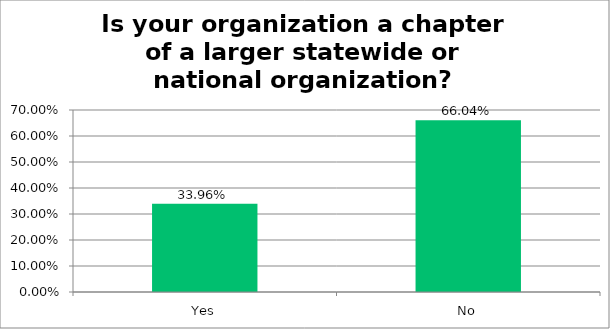
| Category | Responses |
|---|---|
| Yes | 0.34 |
| No | 0.66 |